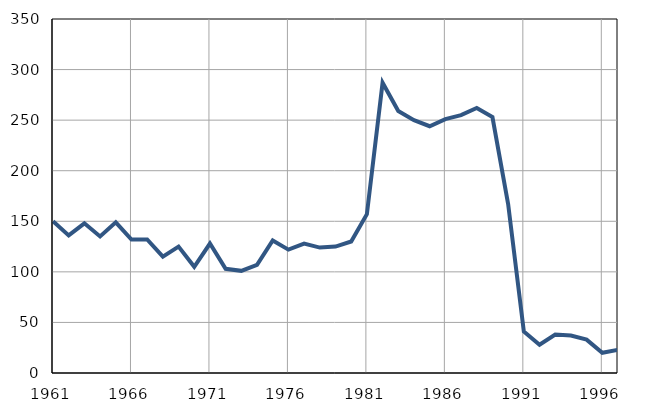
| Category | Infants
deaths |
|---|---|
| 1961.0 | 150 |
| 1962.0 | 136 |
| 1963.0 | 148 |
| 1964.0 | 135 |
| 1965.0 | 149 |
| 1966.0 | 132 |
| 1967.0 | 132 |
| 1968.0 | 115 |
| 1969.0 | 125 |
| 1970.0 | 105 |
| 1971.0 | 128 |
| 1972.0 | 103 |
| 1973.0 | 101 |
| 1974.0 | 107 |
| 1975.0 | 131 |
| 1976.0 | 122 |
| 1977.0 | 128 |
| 1978.0 | 124 |
| 1979.0 | 125 |
| 1980.0 | 130 |
| 1981.0 | 157 |
| 1982.0 | 287 |
| 1983.0 | 259 |
| 1984.0 | 250 |
| 1985.0 | 244 |
| 1986.0 | 251 |
| 1987.0 | 255 |
| 1988.0 | 262 |
| 1989.0 | 253 |
| 1990.0 | 167 |
| 1991.0 | 41 |
| 1992.0 | 28 |
| 1993.0 | 38 |
| 1994.0 | 37 |
| 1995.0 | 33 |
| 1996.0 | 20 |
| 1997.0 | 23 |